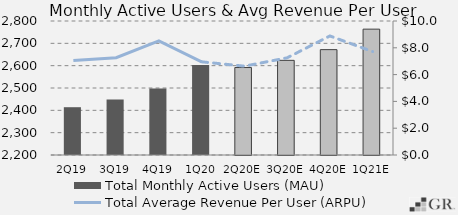
| Category | Total Monthly Active Users (MAU)  |
|---|---|
|  2Q19  | 2414 |
|  3Q19  | 2449 |
|  4Q19  | 2497.8 |
|  1Q20  | 2603 |
|  2Q20E  | 2591.606 |
|  3Q20E  | 2623.776 |
|  4Q20E  | 2671.76 |
|  1Q21E  | 2763.483 |